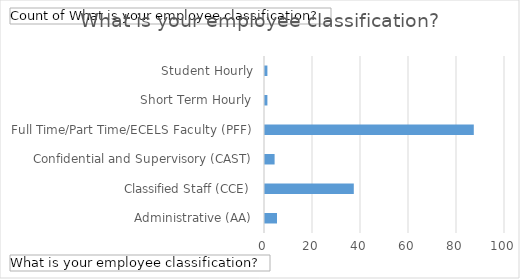
| Category | Total |
|---|---|
| Administrative (AA) | 5 |
| Classified Staff (CCE) | 37 |
| Confidential and Supervisory (CAST) | 4 |
| Full Time/Part Time/ECELS Faculty (PFF) | 87 |
| Short Term Hourly | 1 |
| Student Hourly | 1 |